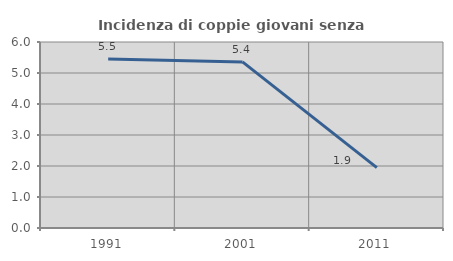
| Category | Incidenza di coppie giovani senza figli |
|---|---|
| 1991.0 | 5.455 |
| 2001.0 | 5.357 |
| 2011.0 | 1.946 |